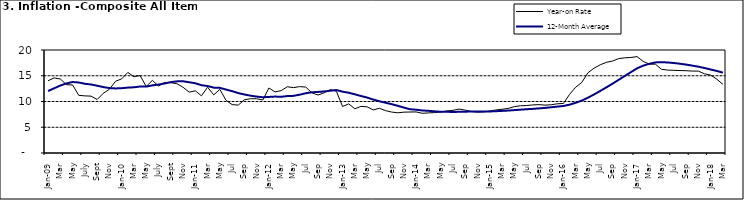
| Category | Year-on Rate | 12-Month Average |
|---|---|---|
| Jan-09 | 14.034 | 12.032 |
| Feb | 14.584 | 12.567 |
| Mar | 14.366 | 13.101 |
| Apr | 13.268 | 13.51 |
| May | 13.212 | 13.787 |
| June | 11.194 | 13.694 |
| July | 11.09 | 13.437 |
| Aug | 11.046 | 13.307 |
| Sept | 10.39 | 13.065 |
| Oct | 11.588 | 12.803 |
| Nov | 12.368 | 12.609 |
| Dec | 13.93 | 12.538 |
| Jan-10 | 14.398 | 12.586 |
| Feb | 15.649 | 12.7 |
| Mar | 14.812 | 12.757 |
| Apr | 15.044 | 12.915 |
| May | 12.915 | 12.893 |
| June | 14.099 | 13.132 |
| July | 13.002 | 13.284 |
| Aug | 13.702 | 13.5 |
| Sept | 13.65 | 13.764 |
| Oct | 13.45 | 13.908 |
| Nov | 12.766 | 13.928 |
| Dec | 11.815 | 13.74 |
| Jan-11 | 12.08 | 13.542 |
| Feb | 11.1 | 13.161 |
| Mar | 12.779 | 13.001 |
| Apr | 11.291 | 12.694 |
| May | 12.352 | 12.648 |
| Jun | 10.23 | 12.321 |
| Jul | 9.397 | 12.009 |
| Aug | 9.301 | 11.635 |
| Sep | 10.339 | 11.363 |
| Oct | 10.544 | 11.13 |
| Nov | 10.54 | 10.952 |
| Dec | 10.283 | 10.826 |
| Jan-12 | 12.626 | 10.886 |
| Feb | 11.866 | 10.955 |
| Mar | 12.111 | 10.914 |
| Apr | 12.866 | 11.054 |
| May | 12.688 | 11.096 |
| Jun | 12.892 | 11.32 |
| Jul | 12.797 | 11.599 |
| Aug | 11.689 | 11.791 |
| Sep | 11.253 | 11.859 |
| Oct | 11.693 | 11.948 |
| Nov | 12.32 | 12.091 |
| Dec | 11.981 | 12.224 |
| Jan-13 | 9.031 | 11.908 |
| Feb | 9.542 | 11.703 |
| Mar | 8.593 | 11.394 |
| Apr | 9.052 | 11.072 |
| May | 8.964 | 10.761 |
| Jun | 8.353 | 10.383 |
| Jul | 8.682 | 10.047 |
| Aug | 8.231 | 9.761 |
| Sep | 7.952 | 9.486 |
| Oct | 7.807 | 9.167 |
| Nov | 7.931 | 8.815 |
| Dec | 7.957 | 8.496 |
| Jan-14 | 7.977 | 8.408 |
| Feb | 7.707 | 8.257 |
| Mar | 7.783 | 8.19 |
| Apr | 7.851 | 8.092 |
| May | 7.965 | 8.012 |
| Jun | 8.167 | 7.998 |
| Jul | 8.281 | 7.968 |
| Aug | 8.534 | 7.996 |
| Sep | 8.317 | 8.027 |
| Oct | 8.06 | 8.047 |
| Nov | 7.927 | 8.046 |
| Dec | 7.978 | 8.047 |
| Jan-15 | 8.157 | 8.063 |
| Feb | 8.359 | 8.117 |
| Mar | 8.494 | 8.176 |
| Apr | 8.655 | 8.243 |
| May | 9.003 | 8.331 |
| Jun | 9.168 | 8.417 |
| Jul | 9.218 | 8.497 |
| Aug | 9.336 | 8.566 |
| Sep | 9.394 | 8.658 |
| Oct | 9.296 | 8.76 |
| Nov | 9.368 | 8.879 |
| Dec | 9.554 | 9.009 |
| Jan-16 | 9.617 | 9.13 |
| Feb | 11.379 | 9.386 |
| Mar | 12.775 | 9.751 |
| Apr | 13.721 | 10.182 |
| May | 15.577 | 10.746 |
| Jun | 16.48 | 11.372 |
| Jul | 17.127 | 12.045 |
| Aug | 17.609 | 12.744 |
| Sep | 17.852 | 13.454 |
| Oct | 18.33 | 14.206 |
| Nov | 18.476 | 14.958 |
| Dec | 18.547 | 15.697 |
| Jan-17 | 18.719 | 16.441 |
| Feb | 17.78 | 16.958 |
| Mar | 17.256 | 17.315 |
| Apr | 17.244 | 17.591 |
| May | 16.251 | 17.628 |
| Jun | 16.098 | 17.578 |
| Jul | 16.053 | 17.475 |
| Aug | 16.012 | 17.331 |
| Sep | 15.979 | 17.17 |
| Oct | 15.905 | 16.968 |
| Nov | 15.901 | 16.76 |
| Dec | 15.372 | 16.502 |
| Jan-18 | 15.127 | 16.215 |
| Feb | 14.33 | 15.93 |
| Mar | 13.337 | 15.599 |